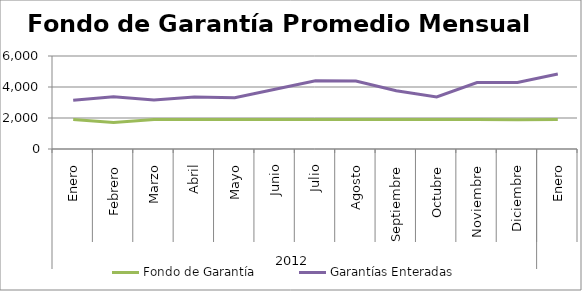
| Category | Fondo de Garantía | Garantías Enteradas |
|---|---|---|
| 0 | 1896.798 | 3141.641 |
| 1 | 1714.423 | 3362.648 |
| 2 | 1900.513 | 3154.118 |
| 3 | 1900.513 | 3348.058 |
| 4 | 1898.685 | 3308.859 |
| 5 | 1900.513 | 3850.375 |
| 6 | 1900.513 | 4400.539 |
| 7 | 1895.388 | 4383.327 |
| 8 | 1900.513 | 3757.632 |
| 9 | 1900.513 | 3362.932 |
| 10 | 1900.311 | 4285.609 |
| 11 | 1890.98 | 4296.87 |
| 12 | 1898.667 | 4842.786 |